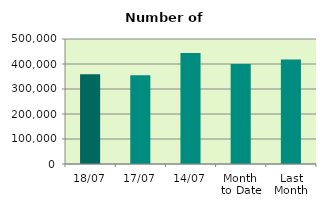
| Category | Series 0 |
|---|---|
| 18/07 | 359420 |
| 17/07 | 354788 |
| 14/07 | 444102 |
| Month 
to Date | 400150.167 |
| Last
Month | 418146.182 |